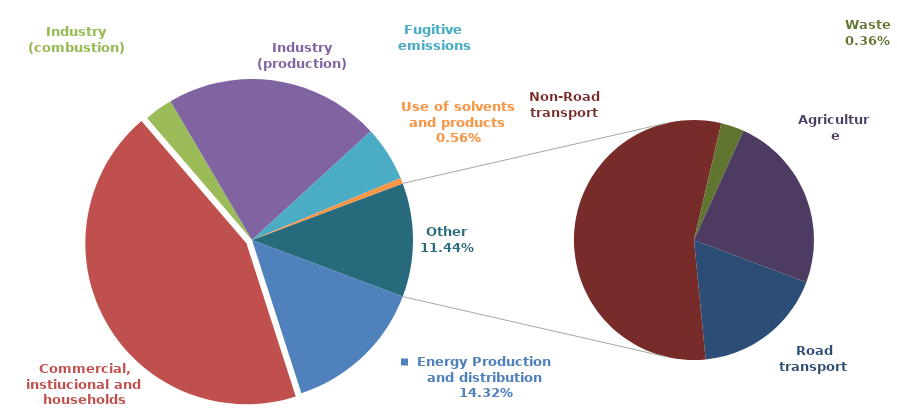
| Category | TSP |
|---|---|
| Energy Production and distribution | 0.143 |
| Commercial, instiucional and households | 0.437 |
| Industry (combustion) | 0.029 |
| Industry (production) | 0.216 |
| Fugitive emissions | 0.055 |
| Use of solvents and products | 0.006 |
| Road transport | 0.02 |
| Non-Road transport | 0.063 |
| Waste | 0.004 |
| Agriculture | 0.027 |